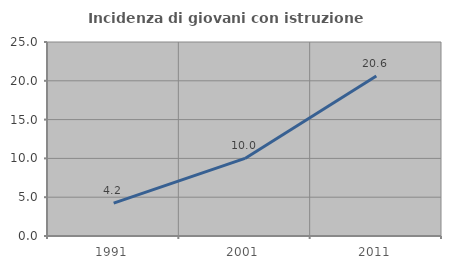
| Category | Incidenza di giovani con istruzione universitaria |
|---|---|
| 1991.0 | 4.233 |
| 2001.0 | 10 |
| 2011.0 | 20.625 |